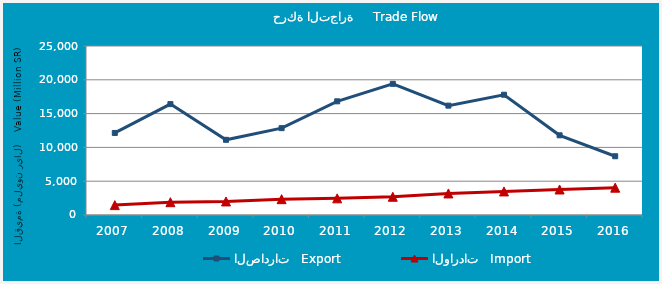
| Category | الصادرات   Export | الواردات   Import |
|---|---|---|
| 2007.0 | 12139.343 | 1462.829 |
| 2008.0 | 16406.147 | 1894.519 |
| 2009.0 | 11120.57 | 2004.493 |
| 2010.0 | 12848.719 | 2341.595 |
| 2011.0 | 16816.414 | 2465.969 |
| 2012.0 | 19404.159 | 2697.43 |
| 2013.0 | 16178.241 | 3187.607 |
| 2014.0 | 17792.327 | 3486.963 |
| 2015.0 | 11788.674 | 3772.548 |
| 2016.0 | 8690.751 | 4041.584 |